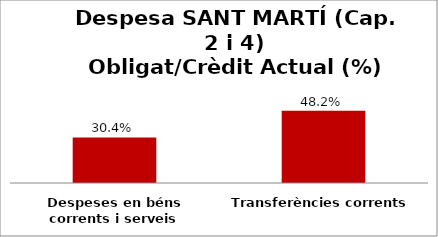
| Category | Series 0 |
|---|---|
| Despeses en béns corrents i serveis | 0.304 |
| Transferències corrents | 0.482 |